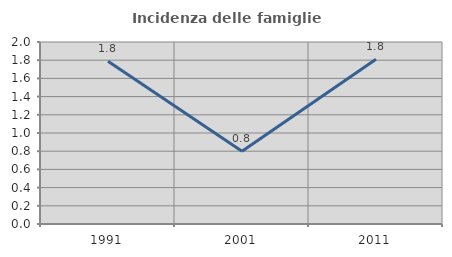
| Category | Incidenza delle famiglie numerose |
|---|---|
| 1991.0 | 1.79 |
| 2001.0 | 0.8 |
| 2011.0 | 1.812 |